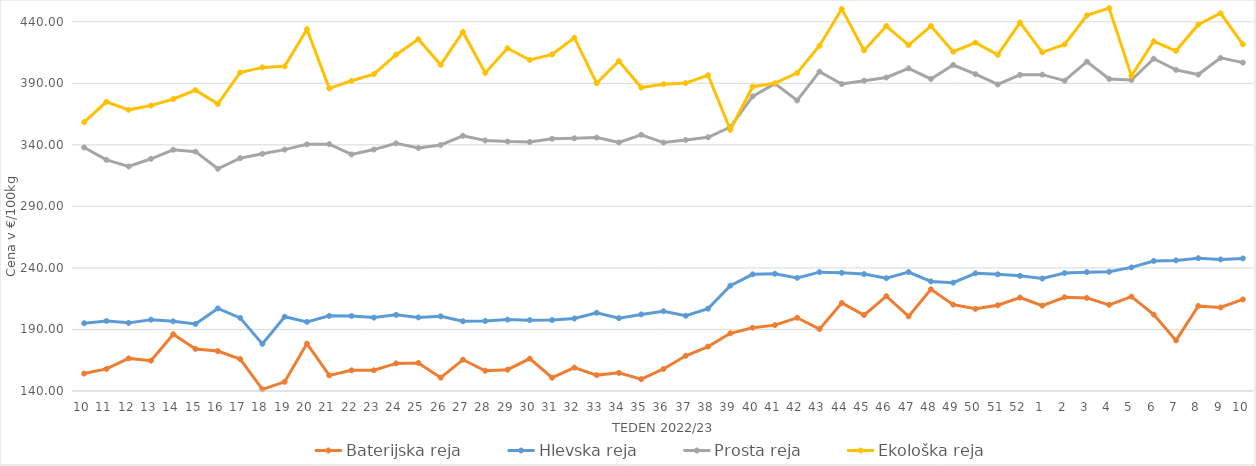
| Category | Baterijska reja | Hlevska reja | Prosta reja | Ekološka reja |
|---|---|---|---|---|
| 10.0 | 154.16 | 195.04 | 337.83 | 358.45 |
| 11.0 | 157.96 | 196.88 | 327.79 | 375 |
| 12.0 | 166.49 | 195.36 | 322.46 | 368.45 |
| 13.0 | 164.66 | 197.95 | 328.67 | 371.9 |
| 14.0 | 186.11 | 196.59 | 336.02 | 377.24 |
| 15.0 | 174.18 | 194.49 | 334.46 | 384.48 |
| 16.0 | 172.42 | 207.1 | 320.58 | 373.28 |
| 17.0 | 165.96 | 199.41 | 329.11 | 398.79 |
| 18.0 | 141.36 | 178.29 | 332.71 | 402.93 |
| 19.0 | 147.43 | 200.37 | 336.11 | 403.79 |
| 20.0 | 178.51 | 196.16 | 340.4 | 433.97 |
| 21.0 | 152.67 | 201.05 | 340.55 | 385.86 |
| 22.0 | 156.8 | 200.98 | 332.23 | 392.07 |
| 23.0 | 156.84 | 199.63 | 336.16 | 397.41 |
| 24.0 | 162.44 | 201.86 | 341.24 | 413.28 |
| 25.0 | 162.78 | 199.81 | 337.48 | 425.86 |
| 26.0 | 150.82 | 200.65 | 339.9 | 405 |
| 27.0 | 165.45 | 196.64 | 347.3 | 431.72 |
| 28.0 | 156.46 | 196.88 | 343.56 | 398.45 |
| 29.0 | 157.31 | 198.03 | 342.71 | 418.45 |
| 30.0 | 166.29 | 197.55 | 342.35 | 408.97 |
| 31.0 | 150.81 | 197.66 | 344.97 | 413.45 |
| 32.0 | 158.99 | 198.9 | 345.35 | 427.07 |
| 33.0 | 152.91 | 203.57 | 345.9 | 390 |
| 34.0 | 154.73 | 199.17 | 341.92 | 408.1 |
| 35.0 | 149.6 | 202.21 | 348.2 | 386.55 |
| 36.0 | 157.93 | 204.81 | 341.85 | 389.31 |
| 37.0 | 168.61 | 201.11 | 343.97 | 390.17 |
| 38.0 | 176.07 | 206.91 | 346.16 | 396.55 |
| 39.0 | 186.86 | 225.6 | 354.41 | 352.24 |
| 40.0 | 191.45 | 234.79 | 379.35 | 387.24 |
| 41.0 | 193.52 | 235.24 | 389.75 | 390 |
| 42.0 | 199.51 | 231.92 | 376.02 | 398.45 |
| 43.0 | 190.28 | 236.56 | 399.51 | 420.52 |
| 44.0 | 211.53 | 236.04 | 389.44 | 450.35 |
| 45.0 | 201.69 | 235.01 | 392.15 | 416.72 |
| 46.0 | 217.08 | 231.68 | 394.71 | 436.55 |
| 47.0 | 200.62 | 236.65 | 402.12 | 421.03 |
| 48.0 | 222.61 | 229.05 | 393.56 | 436.55 |
| 49.0 | 210.16 | 228.03 | 404.87 | 415.69 |
| 50.0 | 206.76 | 235.63 | 397.4 | 423.1 |
| 51.0 | 209.69 | 234.79 | 389.05 | 413.1 |
| 52.0 | 215.87 | 233.58 | 396.87 | 439.31 |
| 1.0 | 209.37 | 231.41 | 397.04 | 415.17 |
| 2.0 | 216.15 | 235.78 | 392.13 | 421.55 |
| 3.0 | 215.63 | 236.58 | 407.61 | 445.17 |
| 4.0 | 210 | 236.85 | 393.58 | 451.04 |
| 5.0 | 216.7 | 240.42 | 392.67 | 396.03 |
| 6.0 | 202.1 | 245.67 | 409.97 | 424.14 |
| 7.0 | 181.11 | 246.12 | 400.94 | 416.38 |
| 8.0 | 209.08 | 247.88 | 397.11 | 437.76 |
| 9.0 | 207.87 | 246.89 | 410.64 | 446.9 |
| 10.0 | 214.42 | 247.73 | 406.8 | 421.72 |